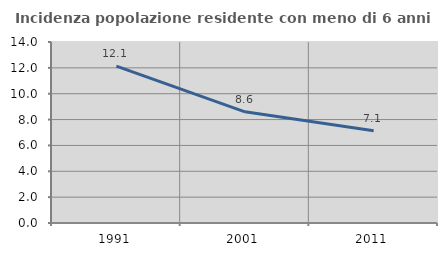
| Category | Incidenza popolazione residente con meno di 6 anni |
|---|---|
| 1991.0 | 12.14 |
| 2001.0 | 8.601 |
| 2011.0 | 7.138 |